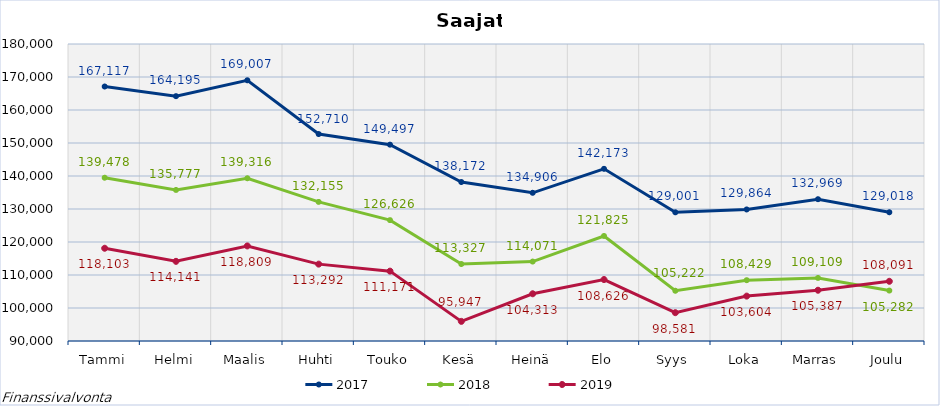
| Category | 2017 | 2018 | 2019 |
|---|---|---|---|
| Tammi | 167117 | 139478 | 118103 |
| Helmi | 164195 | 135777 | 114141 |
| Maalis | 169007 | 139316 | 118809 |
| Huhti | 152710 | 132155 | 113292 |
| Touko | 149497 | 126626 | 111171 |
| Kesä | 138172 | 113327 | 95947 |
| Heinä | 134906 | 114071 | 104313 |
| Elo | 142173 | 121825 | 108626 |
| Syys | 129001 | 105222 | 98581 |
| Loka | 129864 | 108429 | 103604 |
| Marras | 132969 | 109109 | 105387 |
| Joulu | 129018 | 105282 | 108091 |